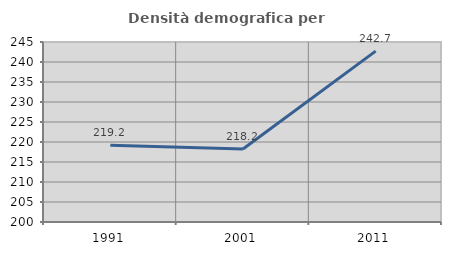
| Category | Densità demografica |
|---|---|
| 1991.0 | 219.21 |
| 2001.0 | 218.237 |
| 2011.0 | 242.72 |